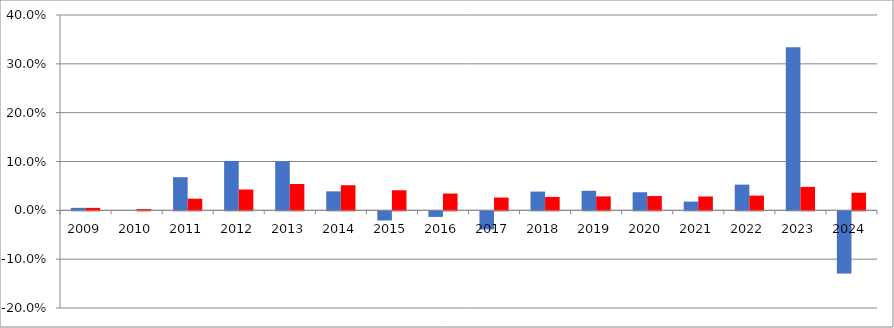
| Category | jählicher Preisanstieg für den günstigsten Preis | mittlerer Preisanstieg pro Jahr seit 2008 |
|---|---|---|
| 2009.0 | 0.005 | 0.005 |
| 2010.0 | 0 | 0.003 |
| 2011.0 | 0.068 | 0.024 |
| 2012.0 | 0.101 | 0.043 |
| 2013.0 | 0.1 | 0.054 |
| 2014.0 | 0.039 | 0.051 |
| 2015.0 | -0.019 | 0.041 |
| 2016.0 | -0.011 | 0.034 |
| 2017.0 | -0.037 | 0.026 |
| 2018.0 | 0.038 | 0.027 |
| 2019.0 | 0.04 | 0.029 |
| 2020.0 | 0.037 | 0.029 |
| 2021.0 | 0.018 | 0.028 |
| 2022.0 | 0.053 | 0.03 |
| 2023.0 | 0.334 | 0.048 |
| 2024.0 | -0.128 | 0.036 |